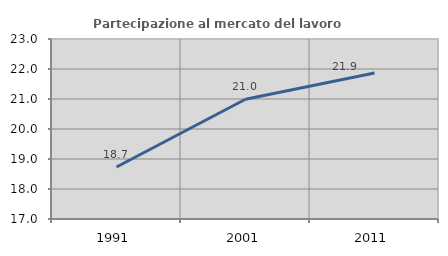
| Category | Partecipazione al mercato del lavoro  femminile |
|---|---|
| 1991.0 | 18.734 |
| 2001.0 | 20.993 |
| 2011.0 | 21.864 |